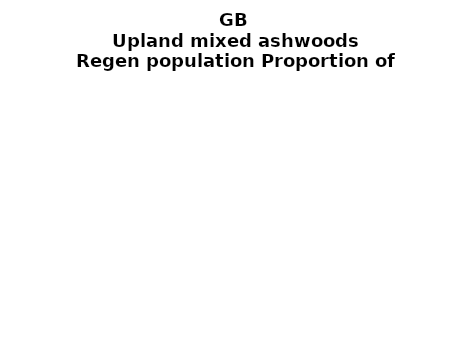
| Category | Upland mixed ashwoods |
|---|---|
| None | 0.037 |
| Seedlings only | 0 |
| Seedlings, saplings only | 0.018 |
| Seedlings, saplings, <7 cm trees | 0.301 |
| Saplings only | 0.119 |
| <7 cm trees, seedlings only | 0 |
| <7 cm trees, saplings only | 0.449 |
| <7 cm Trees only | 0.076 |